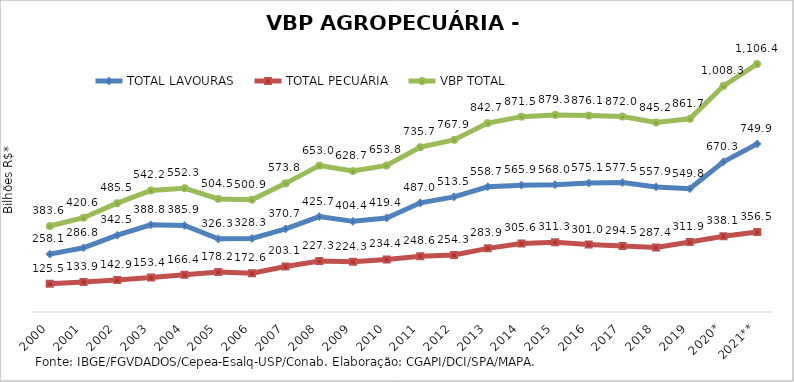
| Category | TOTAL LAVOURAS | TOTAL PECUÁRIA | VBP TOTAL |
|---|---|---|---|
| 2000 | 258.149 | 125.484 | 383.633 |
| 2001 | 286.756 | 133.875 | 420.632 |
| 2002 | 342.54 | 142.913 | 485.453 |
| 2003 | 388.781 | 153.392 | 542.173 |
| 2004 | 385.934 | 166.386 | 552.321 |
| 2005 | 326.29 | 178.24 | 504.53 |
| 2006 | 328.283 | 172.628 | 500.911 |
| 2007 | 370.736 | 203.087 | 573.823 |
| 2008 | 425.697 | 227.303 | 652.999 |
| 2009 | 404.355 | 224.346 | 628.702 |
| 2010 | 419.361 | 234.399 | 653.76 |
| 2011 | 487.036 | 248.637 | 735.673 |
| 2012 | 513.521 | 254.341 | 767.861 |
| 2013 | 558.714 | 283.941 | 842.654 |
| 2014 | 565.902 | 305.601 | 871.503 |
| 2015 | 567.955 | 311.324 | 879.279 |
| 2016 | 575.137 | 300.972 | 876.11 |
| 2017 | 577.525 | 294.505 | 872.031 |
| 2018 | 557.857 | 287.383 | 845.24 |
| 2019 | 549.835 | 311.893 | 861.728 |
| 2020* | 670.261 | 338.072 | 1008.333 |
| 2021** | 749.897 | 356.478 | 1106.375 |